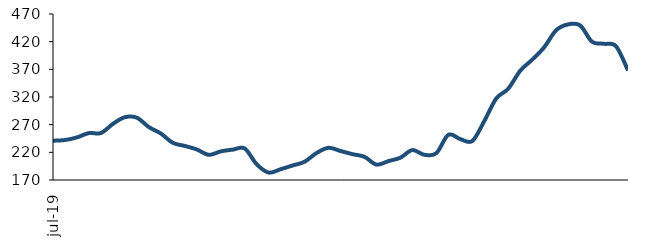
| Category | Series 0 |
|---|---|
| 2019-07-01 | 241.003 |
| 2019-08-01 | 242.252 |
| 2019-09-01 | 246.969 |
| 2019-10-01 | 254.848 |
| 2019-11-01 | 254.863 |
| 2019-12-01 | 271.361 |
| 2020-01-01 | 283.496 |
| 2020-02-01 | 282.571 |
| 2020-03-01 | 265.686 |
| 2020-04-01 | 254.092 |
| 2020-05-01 | 237.244 |
| 2020-06-01 | 231.555 |
| 2020-07-01 | 225.236 |
| 2020-08-01 | 215.435 |
| 2020-09-01 | 221.664 |
| 2020-10-01 | 224.87 |
| 2020-11-01 | 226.946 |
| 2020-12-01 | 198.561 |
| 2021-01-01 | 183.435 |
| 2021-02-01 | 189.419 |
| 2021-03-01 | 196.21 |
| 2021-04-01 | 203.011 |
| 2021-05-01 | 218.776 |
| 2021-06-01 | 228.209 |
| 2021-07-01 | 222.41 |
| 2021-08-01 | 216.706 |
| 2021-09-01 | 211.912 |
| 2021-10-01 | 197.858 |
| 2021-11-01 | 204.149 |
| 2021-12-01 | 210.311 |
| 2022-01-01 | 224.106 |
| 2022-02-01 | 215.528 |
| 2022-03-01 | 218.49 |
| 2022-04-01 | 251.637 |
| 2022-05-01 | 243.929 |
| 2022-06-01 | 240.483 |
| 2022-07-01 | 276.323 |
| 2022-08-01 | 317.225 |
| 2022-09-01 | 334.931 |
| 2022-10-01 | 367.369 |
| 2022-11-01 | 387.357 |
| 2022-12-01 | 409.854 |
| 2023-01-01 | 440.564 |
| 2023-02-01 | 451.235 |
| 2023-03-01 | 449.409 |
| 2023-04-01 | 419.821 |
| 2023-05-01 | 416.162 |
| 2023-06-01 | 411.743 |
| 2023-07-01 | 368.005 |